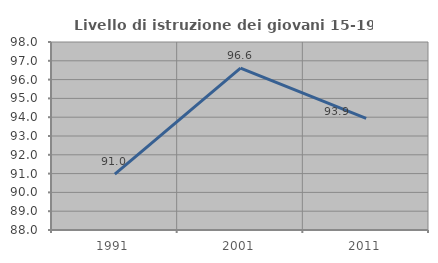
| Category | Livello di istruzione dei giovani 15-19 anni |
|---|---|
| 1991.0 | 90.977 |
| 2001.0 | 96.606 |
| 2011.0 | 93.939 |